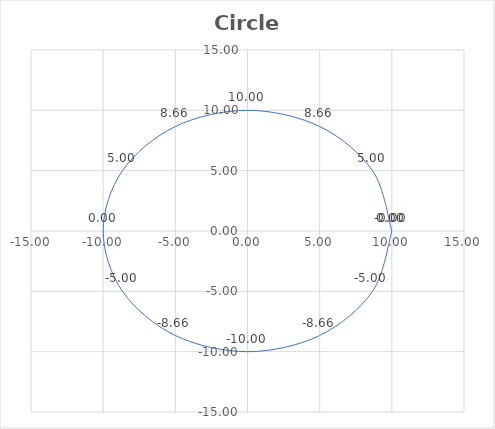
| Category | Series 0 |
|---|---|
| 10.0 | 0 |
| 8.660254037844387 | 5 |
| 5.000000000000001 | 8.66 |
| 6.1257422745431e-16 | 10 |
| -4.999999999999998 | 8.66 |
| -8.660254037844387 | 5 |
| -10.0 | 0 |
| -8.660254037844386 | -5 |
| -5.000000000000004 | -8.66 |
| -1.83772268236293e-15 | -10 |
| 5.000000000000001 | -8.66 |
| 8.660254037844384 | -5 |
| 10.0 | 0 |